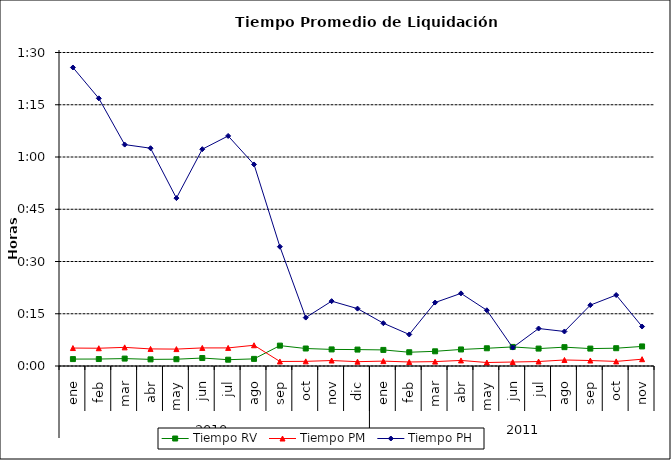
| Category | Tiempo RV | Tiempo PM | Tiempo PH |
|---|---|---|---|
| 0 | 0.001 | 0.004 | 0.06 |
| 1 | 0.001 | 0.004 | 0.053 |
| 2 | 0.001 | 0.004 | 0.044 |
| 3 | 0.001 | 0.003 | 0.043 |
| 4 | 0.001 | 0.003 | 0.033 |
| 5 | 0.002 | 0.004 | 0.043 |
| 6 | 0.001 | 0.004 | 0.046 |
| 7 | 0.001 | 0.004 | 0.04 |
| 8 | 0.004 | 0.001 | 0.024 |
| 9 | 0.003 | 0.001 | 0.01 |
| 10 | 0.003 | 0.001 | 0.013 |
| 11 | 0.003 | 0.001 | 0.011 |
| 12 | 0.003 | 0.001 | 0.009 |
| 13 | 0.003 | 0.001 | 0.006 |
| 14 | 0.003 | 0.001 | 0.013 |
| 15 | 0.003 | 0.001 | 0.014 |
| 16 | 0.004 | 0.001 | 0.011 |
| 17 | 0.004 | 0.001 | 0.004 |
| 18 | 0.003 | 0.001 | 0.007 |
| 19 | 0.004 | 0.001 | 0.007 |
| 20 | 0.003 | 0.001 | 0.012 |
| 21 | 0.004 | 0.001 | 0.014 |
| 22 | 0.004 | 0.001 | 0.008 |